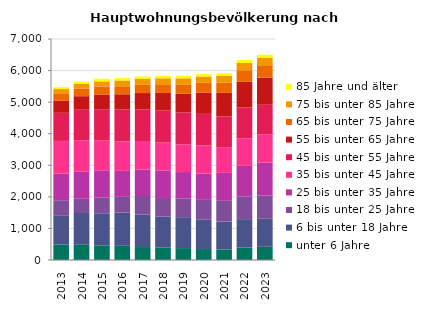
| Category | unter 6 Jahre | 6 bis unter 18 Jahre | 18 bis unter 25 Jahre | 25 bis unter 35 Jahre | 35 bis unter 45 Jahre | 45 bis unter 55 Jahre | 55 bis unter 65 Jahre | 65 bis unter 75 Jahre | 75 bis unter 85 Jahre | 85 Jahre und älter |
|---|---|---|---|---|---|---|---|---|---|---|
| 2013.0 | 488 | 929 | 476 | 839 | 1040 | 890 | 389 | 230 | 134 | 59 |
| 2014.0 | 482 | 1007 | 452 | 854 | 995 | 968 | 431 | 239 | 149 | 71 |
| 2015.0 | 464 | 1016 | 497 | 866 | 950 | 983 | 467 | 245 | 170 | 83 |
| 2016.0 | 449 | 1052 | 500 | 821 | 932 | 1010 | 485 | 254 | 182 | 74 |
| 2017.0 | 410 | 1031 | 587 | 836 | 905 | 1004 | 515 | 260 | 185 | 80 |
| 2018.0 | 392 | 983 | 590 | 875 | 878 | 1013 | 560 | 275 | 188 | 77 |
| 2019.0 | 377 | 980 | 596 | 833 | 872 | 1013 | 593 | 299 | 191 | 80 |
| 2020.0 | 347 | 941 | 617 | 830 | 896 | 998 | 677 | 308 | 197 | 74 |
| 2021.0 | 332 | 884 | 659 | 884 | 815 | 971 | 749 | 323 | 215 | 80 |
| 2022.0 | 395 | 899 | 716 | 971 | 869 | 980 | 812 | 368 | 230 | 95 |
| 2023.0 | 419 | 902 | 725 | 1040 | 893 | 938 | 863 | 389 | 236 | 98 |